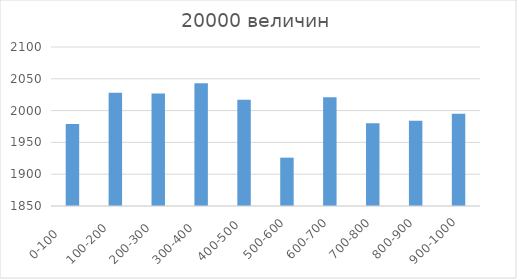
| Category | Series 0 |
|---|---|
| 0-100     | 1979 |
| 100-200   | 2028 |
| 200-300   | 2027 |
| 300-400   | 2043 |
| 400-500  | 2017 |
| 500-600 | 1926 |
| 600-700 | 2021 |
| 700-800 | 1980 |
| 800-900 | 1984 |
| 900-1000 | 1995 |